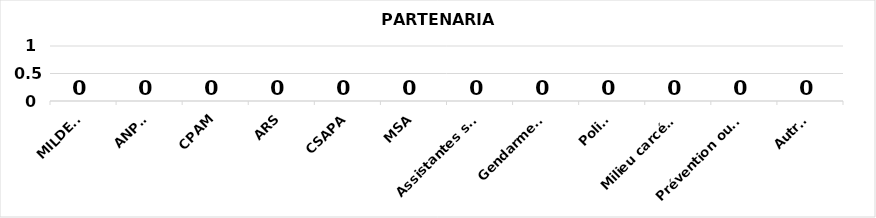
| Category | Series 0 |
|---|---|
| MILDECA | 0 |
| ANPAA | 0 |
| CPAM | 0 |
| ARS | 0 |
| CSAPA | 0 |
| MSA | 0 |
| Assistantes sociales | 0 |
| Gendarmerie | 0 |
| Police | 0 |
| Milieu carcéral | 0 |
| Prévention ou sécurité routière | 0 |
| Autres | 0 |